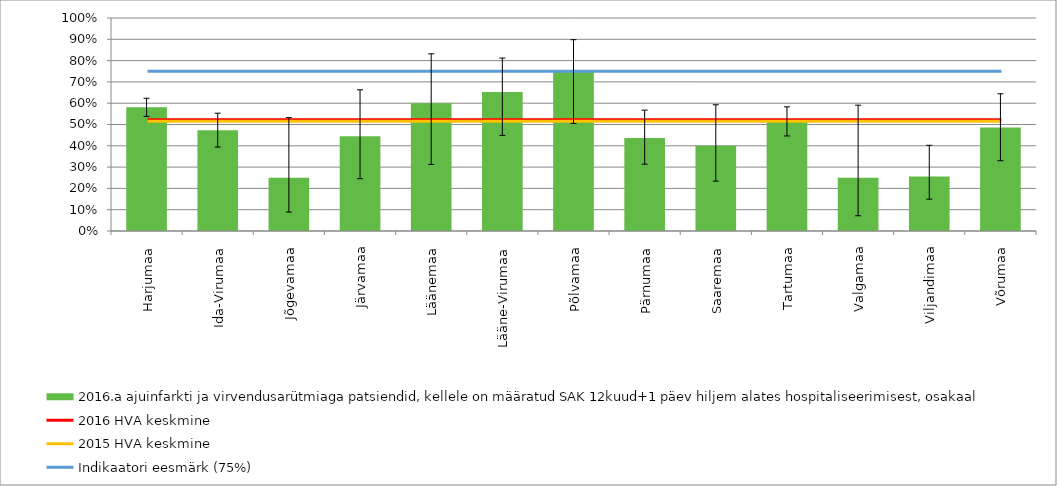
| Category | 2016.a ajuinfarkti ja virvendusarütmiaga patsiendid, kellele on määratud SAK 12kuud+1 päev hiljem alates hospitaliseerimisest, osakaal |
|---|---|
| Harjumaa | 0.581 |
| Ida-Virumaa | 0.473 |
| Jõgevamaa | 0.25 |
| Järvamaa | 0.444 |
| Läänemaa | 0.6 |
| Lääne-Virumaa | 0.652 |
| Põlvamaa | 0.75 |
| Pärnumaa | 0.436 |
| Saaremaa | 0.4 |
| Tartumaa | 0.515 |
| Valgamaa | 0.25 |
| Viljandimaa | 0.256 |
| Võrumaa | 0.486 |